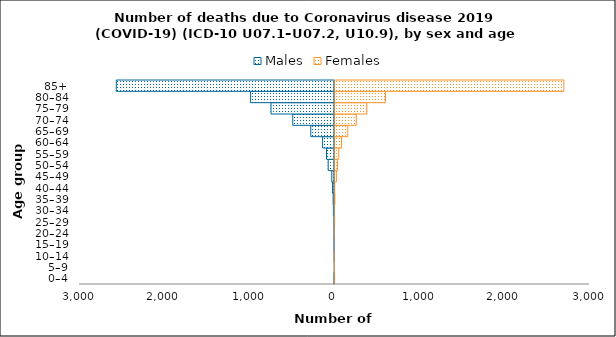
| Category | Males | Females |
|---|---|---|
| 0–4 | -5 | 7 |
| 5–9 | 0 | 1 |
| 10–14 | -1 | 1 |
| 15–19 | -4 | 0 |
| 20–24 | -5 | 2 |
| 25–29 | -5 | 7 |
| 30–34 | -13 | 3 |
| 35–39 | -16 | 11 |
| 40–44 | -24 | 9 |
| 45–49 | -32 | 28 |
| 50–54 | -74 | 42 |
| 55–59 | -94 | 56 |
| 60–64 | -140 | 89 |
| 65–69 | -279 | 162 |
| 70–74 | -491 | 262 |
| 75–79 | -747 | 386 |
| 80–84 | -987 | 605 |
| 85+ | -2567 | 2704 |